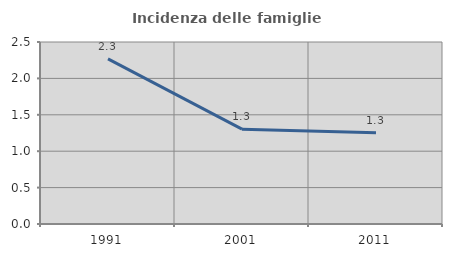
| Category | Incidenza delle famiglie numerose |
|---|---|
| 1991.0 | 2.269 |
| 2001.0 | 1.303 |
| 2011.0 | 1.252 |